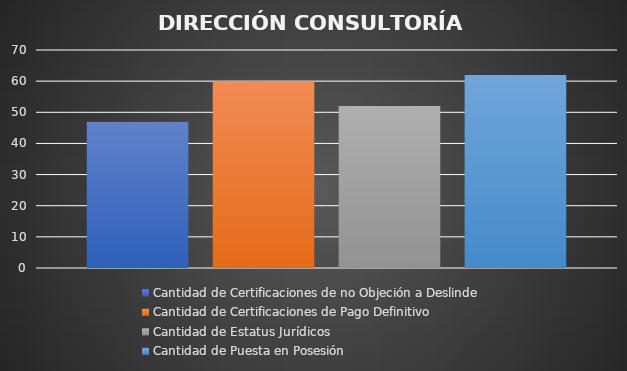
| Category | Cantidad de Certificaciones de no Objeción a Deslinde | Cantidad de Certificaciones de Pago Definitivo  | Cantidad de Estatus Jurídicos | Cantidad de Puesta en Posesión  |
|---|---|---|---|---|
| 0 | 47 | 60 | 52 | 62 |